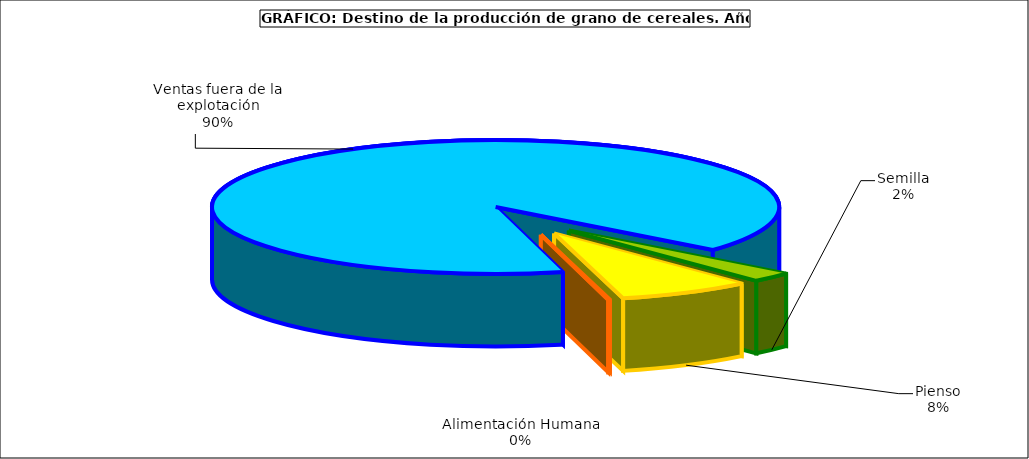
| Category | Series 0 |
|---|---|
| 0 | 589898 |
| 1 | 1870568 |
| 2 | 24396 |
| 3 | 22185213 |